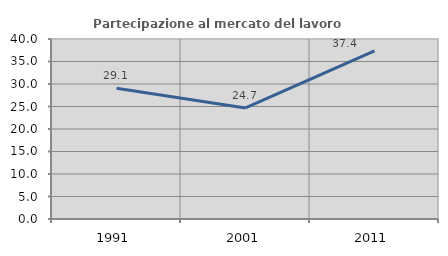
| Category | Partecipazione al mercato del lavoro  femminile |
|---|---|
| 1991.0 | 29.065 |
| 2001.0 | 24.67 |
| 2011.0 | 37.381 |